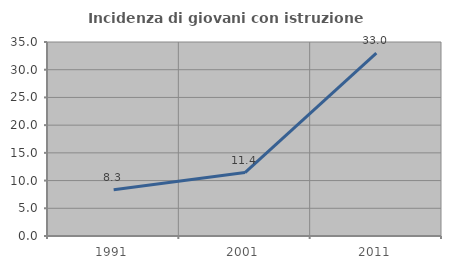
| Category | Incidenza di giovani con istruzione universitaria |
|---|---|
| 1991.0 | 8.333 |
| 2001.0 | 11.438 |
| 2011.0 | 32.979 |